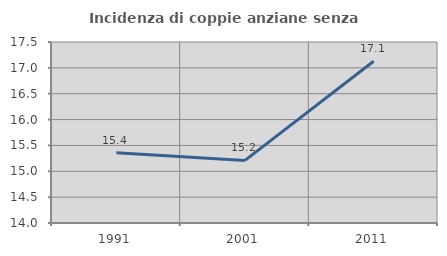
| Category | Incidenza di coppie anziane senza figli  |
|---|---|
| 1991.0 | 15.358 |
| 2001.0 | 15.21 |
| 2011.0 | 17.127 |